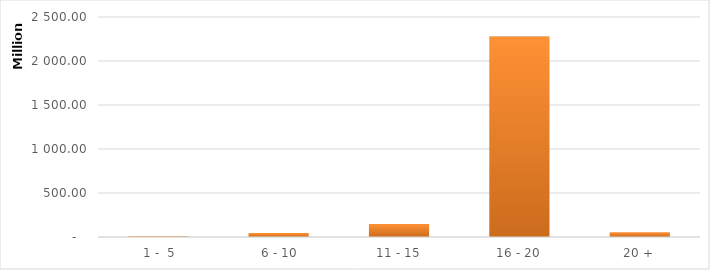
| Category | Series 0 |
|---|---|
|  1 -  5 | 9425114.73 |
|  6 - 10 | 45003688.83 |
| 11 - 15 | 147578356.07 |
| 16 - 20 | 2277881484.17 |
| 20 + | 53761041.3 |